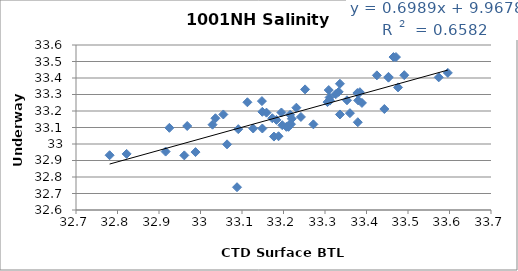
| Category | Series 0 |
|---|---|
| 33.453 | 33.402 |
| 33.453 | 33.407 |
| 33.425 | 33.416 |
| 33.465 | 33.527 |
| 33.471 | 33.527 |
| 33.596 | 33.431 |
| 33.574 | 33.404 |
| 33.476 | 33.343 |
| 33.113 | 33.253 |
| 33.309 | 33.327 |
| 33.389 | 33.249 |
| 33.326 | 33.302 |
| 33.336 | 33.365 |
| 33.379 | 33.132 |
| 33.188 | 33.047 |
| 33.127 | 33.094 |
| 33.149 | 33.195 |
| 33.252 | 33.331 |
| 33.384 | 33.314 |
| 33.491 | 33.417 |
| 33.443 | 33.212 |
| 33.38 | 33.264 |
| 33.312 | 33.263 |
| 33.333 | 33.316 |
| 33.378 | 33.309 |
| 33.36 | 33.187 |
| 33.091 | 33.09 |
| 33.173 | 33.156 |
| 33.214 | 33.116 |
| 33.183 | 33.146 |
| 33.055 | 33.179 |
| 32.961 | 32.931 |
| 32.968 | 33.109 |
| 33.148 | 33.26 |
| 33.311 | 33.282 |
| 33.353 | 33.265 |
| 33.159 | 33.19 |
| 33.306 | 33.254 |
| 33.22 | 33.153 |
| 33.336 | 33.179 |
| 33.231 | 33.22 |
| 33.242 | 33.164 |
| 33.064 | 32.998 |
| 33.088 | 32.738 |
| 32.822 | 32.94 |
| 32.988 | 32.951 |
| 32.925 | 33.098 |
| 33.218 | 33.12 |
| 33.195 | 33.191 |
| 33.207 | 33.104 |
| 33.272 | 33.119 |
| 33.149 | 33.094 |
| 33.197 | 33.114 |
| 33.216 | 33.177 |
| 33.036 | 33.156 |
| 32.916 | 32.954 |
| 32.781 | 32.932 |
| 33.029 | 33.117 |
| 33.177 | 33.045 |
| 33.212 | 33.104 |